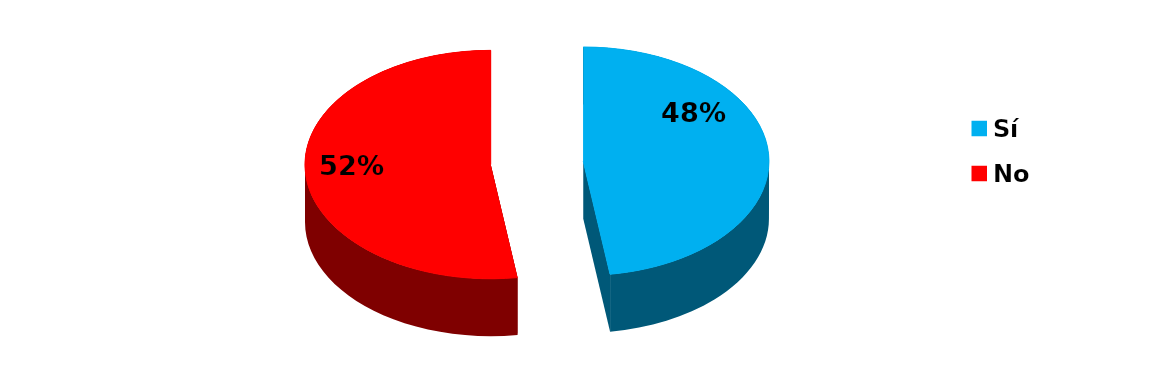
| Category | Series 0 |
|---|---|
| Sí | 62 |
| No | 68 |